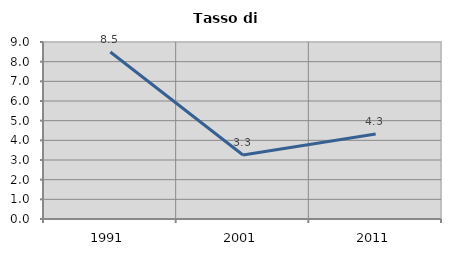
| Category | Tasso di disoccupazione   |
|---|---|
| 1991.0 | 8.491 |
| 2001.0 | 3.257 |
| 2011.0 | 4.327 |